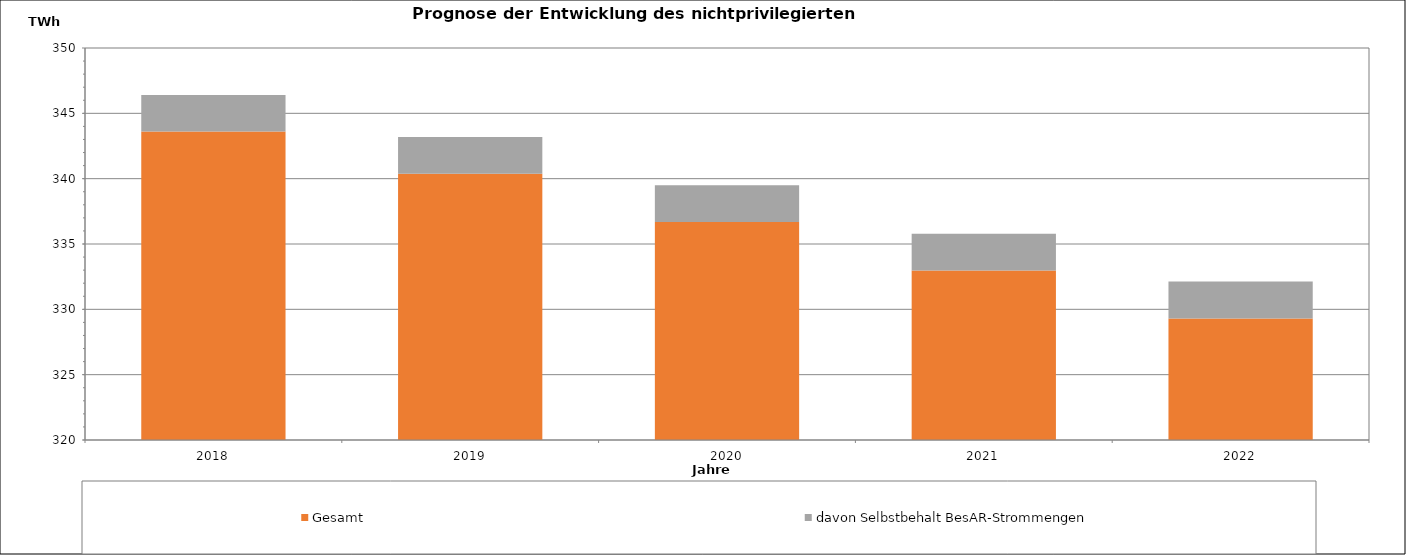
| Category | Gesamt | davon Selbstbehalt BesAR-Strommengen |
|---|---|---|
| 2018.0 | 343.601 | 2.801 |
| 2019.0 | 340.381 | 2.808 |
| 2020.0 | 336.685 | 2.815 |
| 2021.0 | 332.971 | 2.822 |
| 2022.0 | 329.294 | 2.829 |